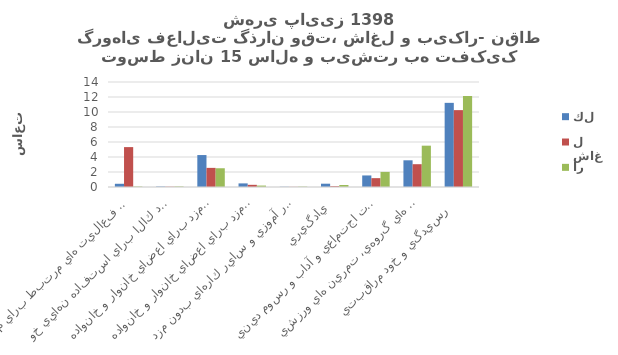
| Category | كل | شاغل | بيكار |
|---|---|---|---|
| اشتغال و فعاليت هاي مرتبط براي مزد  | 0.43 | 5.32 | 0.06 |
| توليد كالا براي استفاده نهايي خود   | 0.06 | 0.04 | 0.07 |
| خدمات خانگي بدون مزد براي اعضاي خانوار و خانواده   | 4.26 | 2.55 | 2.5 |
| خدمات مراقبتي بدون مزد براي اعضاي خانوار و خانواده   | 0.48 | 0.29 | 0.19 |
| كارداوطلبانه بدون مزد، كار آموزي و ساير كارهاي بدون مزد  | 0.03 | 0.02 | 0.05 |
| يادگيري  | 0.44 | 0.11 | 0.27 |
| معاشرت، ارتباط، مشاركت اجتماعي و آداب و رسوم ديني  | 1.54 | 1.18 | 2.01 |
| فرهنگ، فراغت، رسانه هاي گروهي، تمرين هاي ورزشي  | 3.56 | 3.04 | 5.51 |
| رسيدگي و خود مراقبتي   | 11.22 | 10.25 | 12.15 |